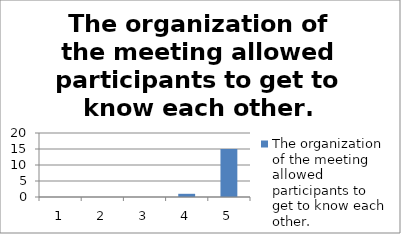
| Category | The organization of the meeting allowed participants to get to know each other. |
|---|---|
| 0 | 0 |
| 1 | 0 |
| 2 | 0 |
| 3 | 1 |
| 4 | 15 |